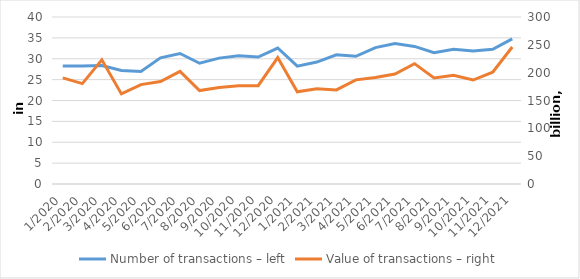
| Category | Number of transactions – left |
|---|---|
| 1/2020 | 28256095 |
| 2/2020 | 28274985 |
| 3/2020 | 28400981 |
| 4/2020 | 27204598 |
| 5/2020 | 26966811 |
| 6/2020 | 30208024 |
| 7/2020 | 31260868 |
| 8/2020 | 28920407 |
| 9/2020 | 30154281 |
| 10/2020 | 30730172 |
| 11/2020 | 30406511 |
| 12/2020 | 32570998 |
| 1/2021 | 28234650 |
| 2/2021 | 29203774 |
| 3/2021 | 30934006 |
| 4/2021 | 30576547 |
| 5/2021 | 32664164 |
| 6/2021 | 33632088 |
| 7/2021 | 32954974 |
| 8/2021 | 31437818 |
| 9/2021 | 32298015 |
| 10/2021 | 31846909 |
| 11/2021 | 32256891 |
| 12/2021 | 34755901 |